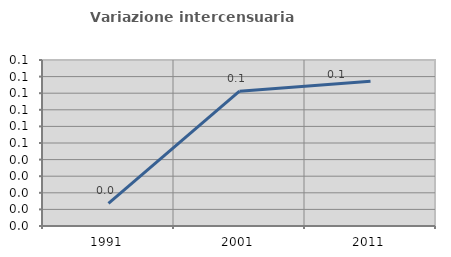
| Category | Variazione intercensuaria annua |
|---|---|
| 1991.0 | 0.014 |
| 2001.0 | 0.081 |
| 2011.0 | 0.087 |